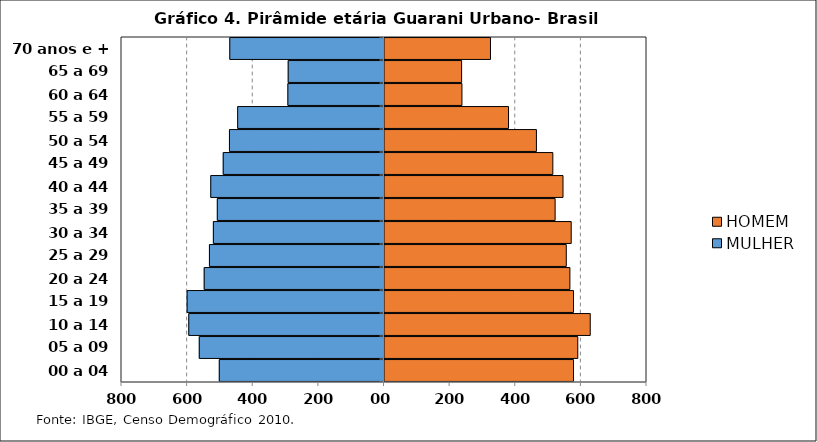
| Category | MULHER | HOMEM |
|---|---|---|
| 00 a 04 anos | -502 | 576 |
| 05 a 09 anos | -563 | 589 |
| 10 a 14 anos | -595 | 627 |
| 15 a 19 anos | -600 | 576 |
| 20 a 24 anos | -548 | 565 |
| 25 a 29 anos | -532 | 554 |
| 30 a 34 anos | -520 | 569 |
| 35 a 39 anos | -508 | 520 |
| 40 a 44 anos | -528 | 544 |
| 45 a 49 anos | -490 | 513 |
| 50 a 54 anos | -471 | 463 |
| 55 a 59 anos | -446 | 378 |
| 60 a 64 anos | -293 | 236 |
| 65 a 69 anos | -292 | 235 |
| 70 anos e + | -470 | 323 |